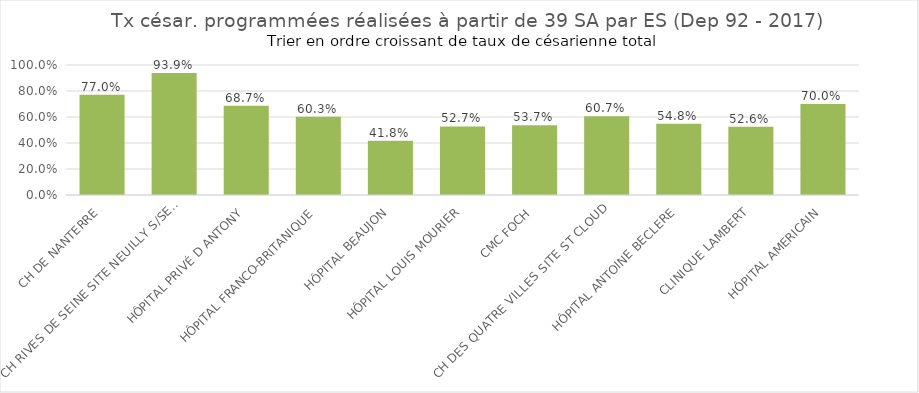
| Category | Tx césar. programmées 
réalisées à partir de 39 SA |
|---|---|
| CH DE NANTERRE | 0.77 |
| CH RIVES DE SEINE SITE NEUILLY S/SEINE | 0.939 |
| HÔPITAL PRIVÉ D ANTONY | 0.687 |
| HÔPITAL FRANCO-BRITANIQUE | 0.603 |
| HÔPITAL BEAUJON | 0.418 |
| HÔPITAL LOUIS MOURIER | 0.527 |
| CMC FOCH | 0.537 |
| CH DES QUATRE VILLES SITE ST CLOUD | 0.607 |
| HÔPITAL ANTOINE BECLERE | 0.548 |
| CLINIQUE LAMBERT | 0.526 |
| HÔPITAL AMERICAIN | 0.7 |